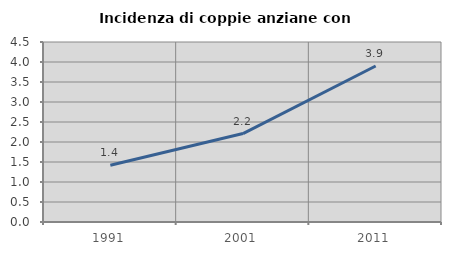
| Category | Incidenza di coppie anziane con figli |
|---|---|
| 1991.0 | 1.417 |
| 2001.0 | 2.211 |
| 2011.0 | 3.901 |